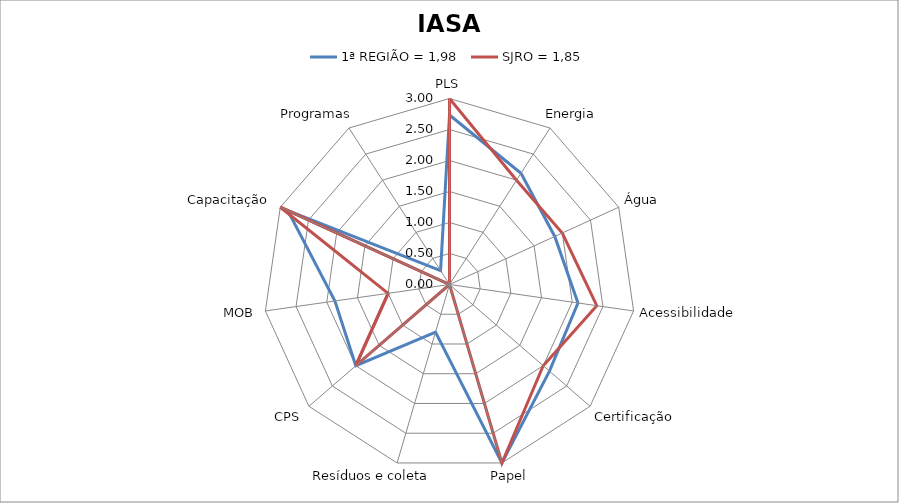
| Category | 1ª REGIÃO = 1,98 | SJRO = 1,85 |
|---|---|---|
| PLS | 2.733 | 3 |
| Energia | 2.133 | 2 |
| Água | 1.867 | 2 |
| Acessibilidade | 2.093 | 2.4 |
| Certificação | 2.133 | 2 |
| Papel | 3 | 3 |
| Resíduos e coleta | 0.8 | 0 |
| CPS | 2 | 2 |
| MOB | 1.867 | 1 |
| Capacitação | 2.867 | 3 |
| Programas | 0.267 | 0 |